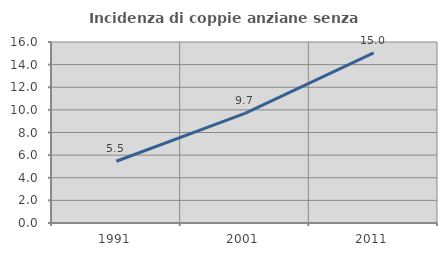
| Category | Incidenza di coppie anziane senza figli  |
|---|---|
| 1991.0 | 5.459 |
| 2001.0 | 9.693 |
| 2011.0 | 15.03 |